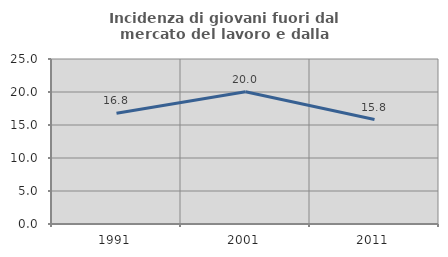
| Category | Incidenza di giovani fuori dal mercato del lavoro e dalla formazione  |
|---|---|
| 1991.0 | 16.789 |
| 2001.0 | 20.028 |
| 2011.0 | 15.824 |